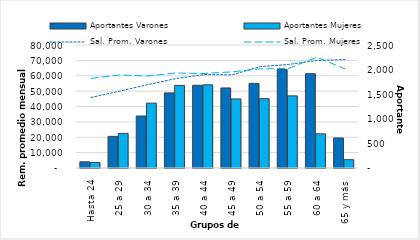
| Category | Aportantes Varones | Aportantes Mujeres |
|---|---|---|
| Hasta 24 | 126 | 113 |
| 25 a 29 | 643 | 703 |
| 30 a 34 | 1056 | 1318 |
| 35 a 39 | 1526 | 1679 |
| 40 a 44 | 1682 | 1691 |
| 45 a 49 | 1627 | 1404 |
| 50 a 54 | 1720 | 1409 |
| 55 a 59 | 2000 | 1466 |
| 60 a 64 | 1916 | 694 |
| 65 y más | 611 | 169 |